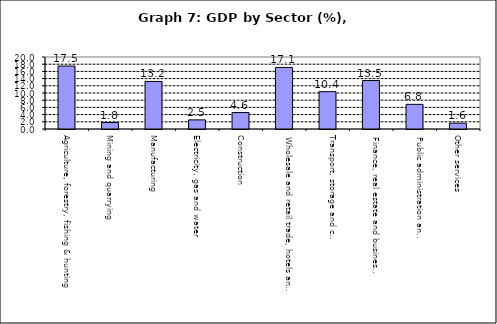
| Category | Series 0 |
|---|---|
| Agriculture, forestry, fishing & hunting | 17.493 |
| Mining and quarrying  | 1.796 |
| Manufacturing | 13.211 |
| Electricity, gas and water | 2.533 |
| Construction | 4.569 |
| Wholesale and retail trade, hotels and restaurants  | 17.105 |
| Transport, storage and communication                | 10.375 |
| Finance, real estate and business services          | 13.461 |
| Public administration and Defense                       | 6.849 |
| Other services                                    | 1.634 |